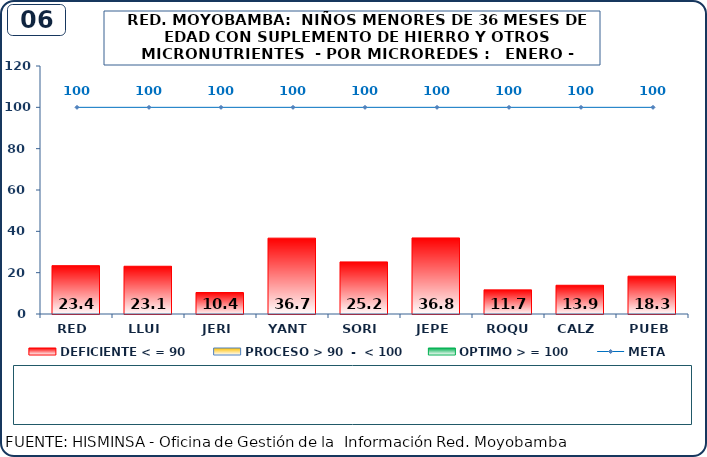
| Category | DEFICIENTE < = 90 | PROCESO > 90  -  < 100 | OPTIMO > = 100 |
|---|---|---|---|
| RED | 23.4 | 0 | 0 |
| LLUI | 23.1 | 0 | 0 |
| JERI | 10.4 | 0 | 0 |
| YANT | 36.7 | 0 | 0 |
| SORI | 25.2 | 0 | 0 |
| JEPE | 36.8 | 0 | 0 |
| ROQU | 11.7 | 0 | 0 |
| CALZ | 13.9 | 0 | 0 |
| PUEB | 18.3 | 0 | 0 |